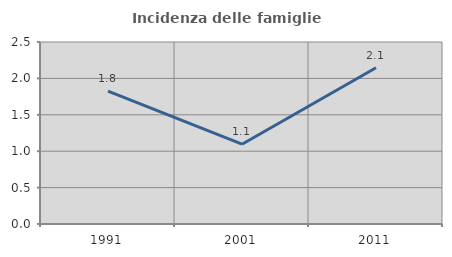
| Category | Incidenza delle famiglie numerose |
|---|---|
| 1991.0 | 1.826 |
| 2001.0 | 1.096 |
| 2011.0 | 2.145 |